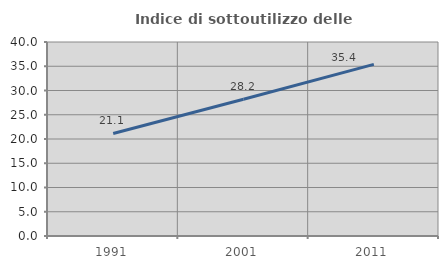
| Category | Indice di sottoutilizzo delle abitazioni  |
|---|---|
| 1991.0 | 21.14 |
| 2001.0 | 28.207 |
| 2011.0 | 35.391 |